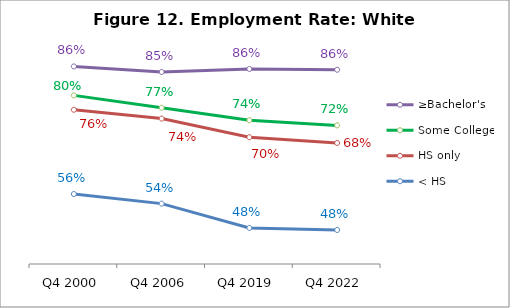
| Category | ≥Bachelor's | Some College | HS only | < HS |
|---|---|---|---|---|
| Q4 2000 | 0.863 | 0.795 | 0.761 | 0.564 |
| Q4 2006 | 0.85 | 0.766 | 0.741 | 0.541 |
| Q4 2019 | 0.857 | 0.737 | 0.697 | 0.485 |
| Q4 2022 | 0.855 | 0.725 | 0.684 | 0.48 |